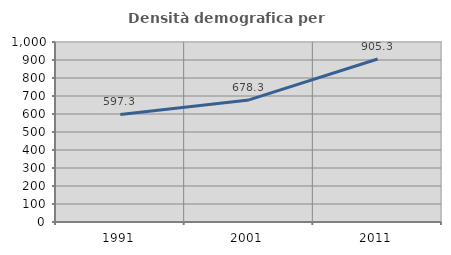
| Category | Densità demografica |
|---|---|
| 1991.0 | 597.326 |
| 2001.0 | 678.3 |
| 2011.0 | 905.255 |